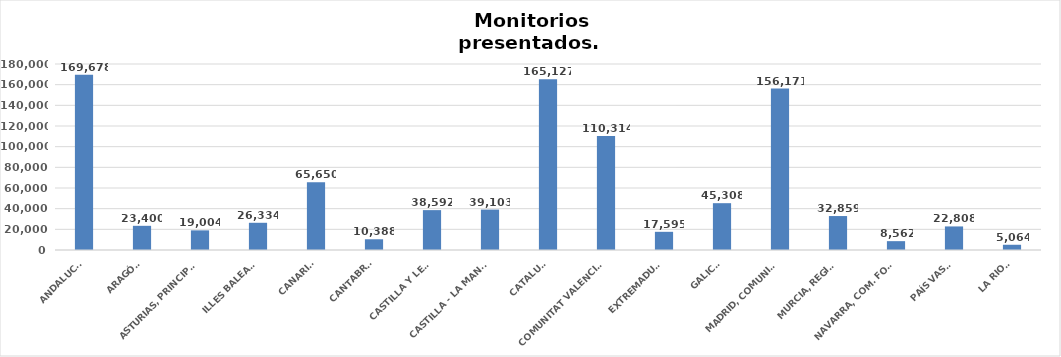
| Category | Series 0 |
|---|---|
| ANDALUCÍA | 169678 |
| ARAGÓN | 23400 |
| ASTURIAS, PRINCIPADO | 19004 |
| ILLES BALEARS | 26334 |
| CANARIAS | 65650 |
| CANTABRIA | 10388 |
| CASTILLA Y LEÓN | 38592 |
| CASTILLA - LA MANCHA | 39103 |
| CATALUÑA | 165127 |
| COMUNITAT VALENCIANA | 110314 |
| EXTREMADURA | 17595 |
| GALICIA | 45308 |
| MADRID, COMUNIDAD | 156171 |
| MURCIA, REGIÓN | 32859 |
| NAVARRA, COM. FORAL | 8562 |
| PAÍS VASCO | 22808 |
| LA RIOJA | 5064 |